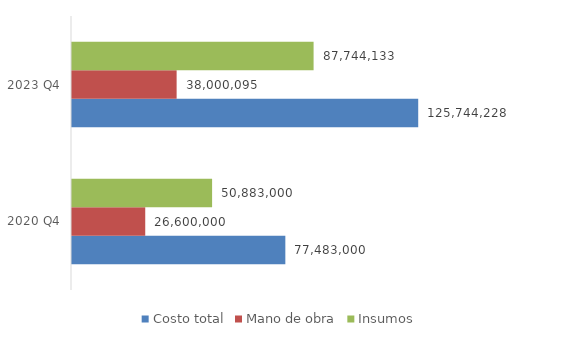
| Category | Costo total | Mano de obra | Insumos |
|---|---|---|---|
| 2020 Q4 | 77483000 | 26600000 | 50883000 |
| 2023 Q4 | 125744227.651 | 38000095 | 87744132.651 |